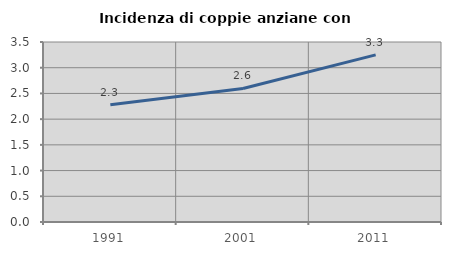
| Category | Incidenza di coppie anziane con figli |
|---|---|
| 1991.0 | 2.28 |
| 2001.0 | 2.596 |
| 2011.0 | 3.25 |